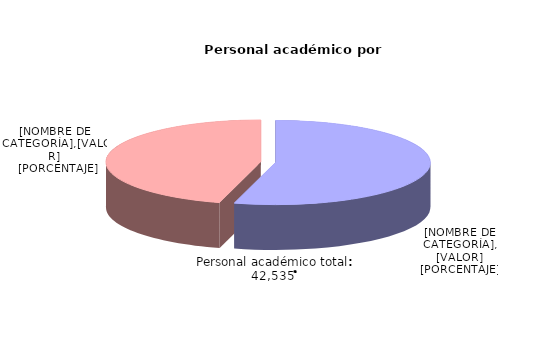
| Category | Series 0 | Series 1 |
|---|---|---|
| Hombres | 23089 | 54.282 |
| Mujeres | 19446 | 45.718 |